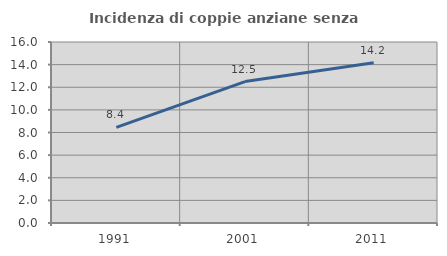
| Category | Incidenza di coppie anziane senza figli  |
|---|---|
| 1991.0 | 8.447 |
| 2001.0 | 12.5 |
| 2011.0 | 14.162 |